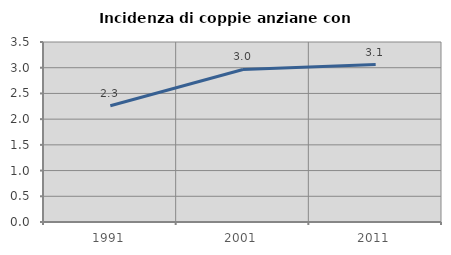
| Category | Incidenza di coppie anziane con figli |
|---|---|
| 1991.0 | 2.261 |
| 2001.0 | 2.965 |
| 2011.0 | 3.062 |